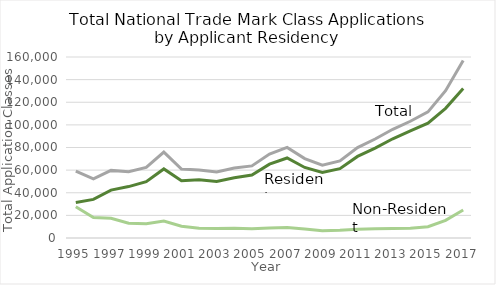
| Category | Resident Applications2 | Non-Resident Applications | Total |
|---|---|---|---|
| 1995.0 | 31399 | 27654 | 59053 |
| 1996.0 | 34109 | 18097 | 52206 |
| 1997.0 | 42303 | 17457 | 59760 |
| 1998.0 | 45455 | 13076 | 58531 |
| 1999.0 | 49825 | 12515 | 62340 |
| 2000.0 | 61050 | 14907 | 75957 |
| 2001.0 | 50610 | 10391 | 61001 |
| 2002.0 | 51399 | 8666 | 60065 |
| 2003.0 | 49876 | 8494 | 58370 |
| 2004.0 | 53304 | 8627 | 61931 |
| 2005.0 | 55600 | 8126 | 63726 |
| 2006.0 | 65305 | 8841 | 74146 |
| 2007.0 | 70739 | 9294 | 80033 |
| 2008.0 | 62349 | 7891 | 70240 |
| 2009.0 | 58029 | 6402 | 64431 |
| 2010.0 | 61318 | 6823 | 68141 |
| 2011.0 | 72119 | 7779 | 79898 |
| 2012.0 | 79405 | 8104 | 87509 |
| 2013.0 | 87732 | 8363 | 96095 |
| 2014.0 | 94593 | 8593 | 103186 |
| 2015.0 | 101456 | 10031 | 111487 |
| 2016.0 | 114633 | 15597 | 130230 |
| 2017.0 | 132089 | 24748 | 156837 |